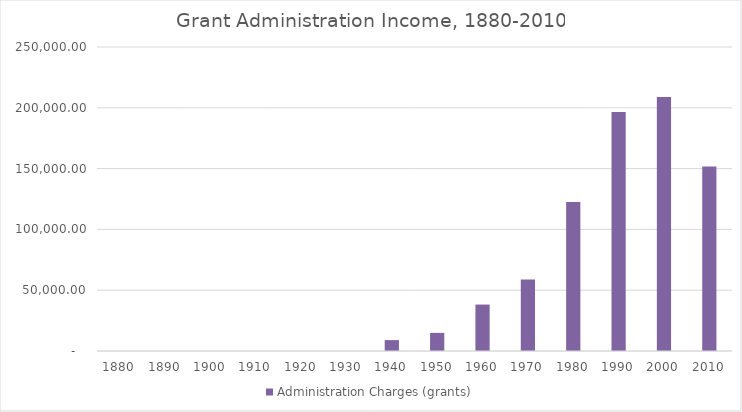
| Category | Administration Charges (grants) |
|---|---|
| 1880.0 | 0 |
| 1890.0 | 0 |
| 1900.0 | 0 |
| 1910.0 | 0 |
| 1920.0 | 0 |
| 1930.0 | 0 |
| 1940.0 | 8968.517 |
| 1950.0 | 14894.604 |
| 1960.0 | 38181.574 |
| 1970.0 | 58879 |
| 1980.0 | 122464.425 |
| 1990.0 | 196511.247 |
| 2000.0 | 208853.197 |
| 2010.0 | 151693.297 |